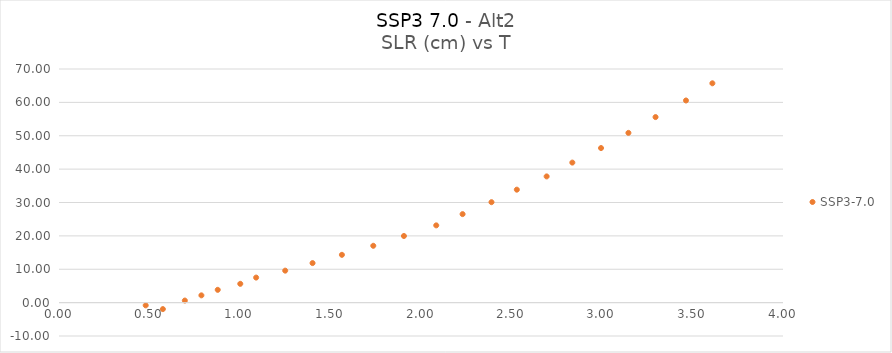
| Category | SSP3-7.0 |
|---|---|
| 0.573801925 | -1.941 |
| 0.479031654 | -0.818 |
| 0.695197934 | 0.621 |
| 0.786748548 | 2.18 |
| 0.877021499 | 3.834 |
| 1.001520332 | 5.633 |
| 1.089128948 | 7.505 |
| 1.249789297 | 9.582 |
| 1.40082264 | 11.846 |
| 1.563056609 | 14.321 |
| 1.736366954 | 17.029 |
| 1.905656517 | 19.966 |
| 2.084176389 | 23.15 |
| 2.229740262 | 26.517 |
| 2.38946116 | 30.096 |
| 2.529456517 | 33.844 |
| 2.694135726 | 37.815 |
| 2.836094375 | 41.959 |
| 2.994666226 | 46.313 |
| 3.14599335 | 50.86 |
| 3.295873187 | 55.597 |
| 3.46403486 | 60.566 |
| 3.609831107 | 65.716 |